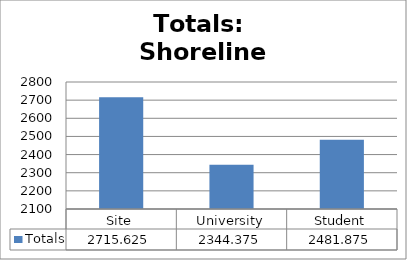
| Category | Totals |
|---|---|
| Site | 2715.625 |
| University | 2344.375 |
| Student | 2481.875 |